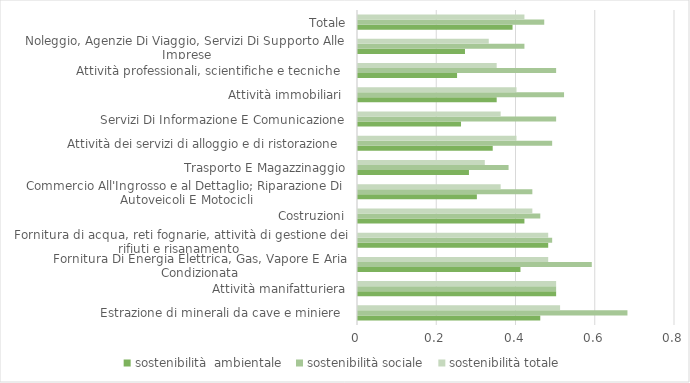
| Category | sostenibilità  ambientale  | sostenibilità sociale  | sostenibilità totale |
|---|---|---|---|
| Estrazione di minerali da cave e miniere  | 0.46 | 0.68 | 0.51 |
| Attività manifatturiera | 0.5 | 0.5 | 0.5 |
| Fornitura Di Energia Elettrica, Gas, Vapore E Aria Condizionata | 0.41 | 0.59 | 0.48 |
| Fornitura di acqua, reti fognarie, attività di gestione dei rifiuti e risanamento  | 0.48 | 0.49 | 0.48 |
| Costruzioni | 0.42 | 0.46 | 0.44 |
| Commercio All'Ingrosso e al Dettaglio; Riparazione Di Autoveicoli E Motocicli | 0.3 | 0.44 | 0.36 |
| Trasporto E Magazzinaggio | 0.28 | 0.38 | 0.32 |
| Attività dei servizi di alloggio e di ristorazione  | 0.34 | 0.49 | 0.4 |
| Servizi Di Informazione E Comunicazione | 0.26 | 0.5 | 0.36 |
| Attività immobiliari  | 0.35 | 0.52 | 0.4 |
| Attività professionali, scientifiche e tecniche  | 0.25 | 0.5 | 0.35 |
| Noleggio, Agenzie Di Viaggio, Servizi Di Supporto Alle Imprese | 0.27 | 0.42 | 0.33 |
| Totale | 0.39 | 0.47 | 0.42 |